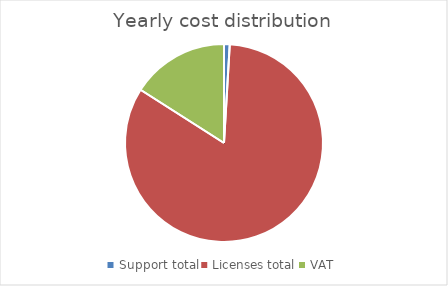
| Category | Series 0 |
|---|---|
| Support total | 80.058 |
| Licenses total | 7168.3 |
| VAT | 1377.188 |